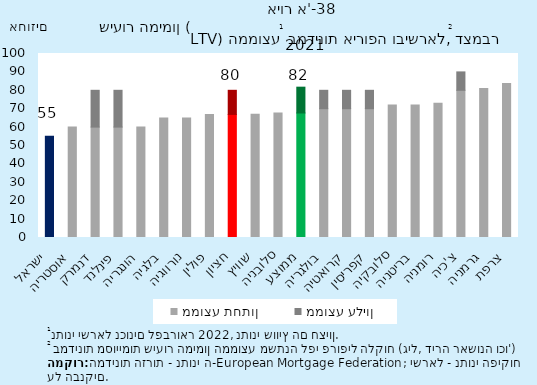
| Category | ממוצע תחתון | ממוצע עליון |
|---|---|---|
| ישראל | 55 | 0 |
| אוסטריה | 60 | 0 |
| דנמרק | 60 | 20 |
| פינלנד | 60 | 20 |
| הונגריה | 60 | 0 |
| בלגיה | 65 | 0 |
| נורווגיה | 65 | 0 |
| פולין | 66.792 | 0 |
| חציון | 66.896 | 13.104 |
| שוויץ | 67 | 0 |
| סלובניה | 67.6 | 0 |
| ממוצע | 67.672 | 14.028 |
| בולגריה | 70 | 10 |
| קרואטיה | 70 | 10 |
| קפריסין | 70 | 10 |
| סלובקיה | 72 | 0 |
| בריטניה | 72 | 0 |
| רומניה | 73 | 0 |
| צ'כיה | 80 | 10 |
| גרמניה | 81 | 0 |
| צרפת | 83.7 | 0 |